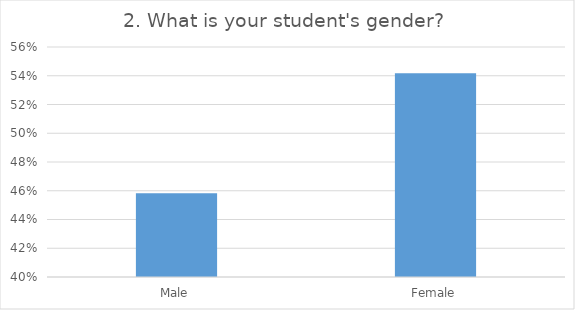
| Category | 2. What is your student's gender?  |
|---|---|
| Male | 0.458 |
| Female | 0.542 |